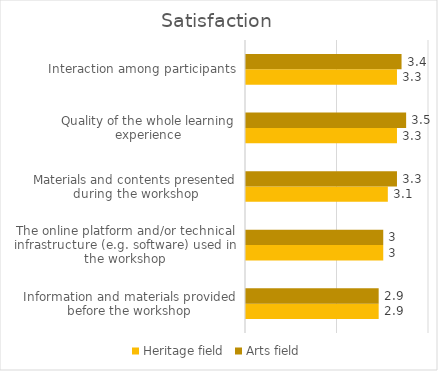
| Category | Heritage field | Arts field |
|---|---|---|
| Information and materials provided before the workshop | 2.9 | 2.9 |
| The online platform and/or technical infrastructure (e.g. software) used in the workshop | 3 | 3 |
| Materials and contents presented during the workshop | 3.1 | 3.3 |
| Quality of the whole learning experience | 3.3 | 3.5 |
| Interaction among participants | 3.3 | 3.4 |